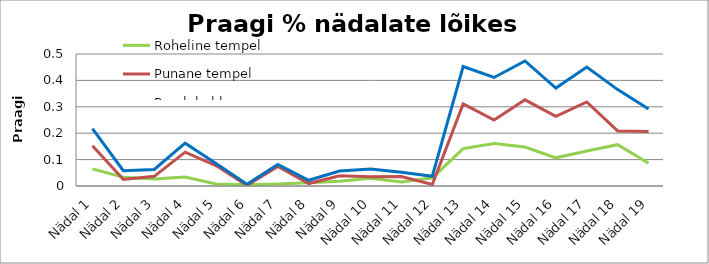
| Category | Roheline tempel | Punane tempel | Praak kokku |
|---|---|---|---|
| Nädal 1 | 0.065 | 0.153 | 0.218 |
| Nädal 2 | 0.033 | 0.025 | 0.058 |
| Nädal 3 | 0.026 | 0.037 | 0.063 |
| Nädal 4 | 0.034 | 0.128 | 0.162 |
| Nädal 5 | 0.008 | 0.078 | 0.086 |
| Nädal 6 | 0.005 | 0.002 | 0.007 |
| Nädal 7 | 0.007 | 0.074 | 0.081 |
| Nädal 8 | 0.012 | 0.009 | 0.022 |
| Nädal 9 | 0.018 | 0.039 | 0.057 |
| Nädal 10 | 0.03 | 0.035 | 0.065 |
| Nädal 11 | 0.016 | 0.036 | 0.052 |
| Nädal 12 | 0.031 | 0.006 | 0.037 |
| Nädal 13 | 0.142 | 0.311 | 0.453 |
| Nädal 14 | 0.161 | 0.25 | 0.411 |
| Nädal 15 | 0.147 | 0.326 | 0.474 |
| Nädal 16 | 0.107 | 0.264 | 0.371 |
| Nädal 17 | 0.132 | 0.318 | 0.451 |
| Nädal 18 | 0.156 | 0.209 | 0.365 |
| Nädal 19 | 0.086 | 0.206 | 0.292 |